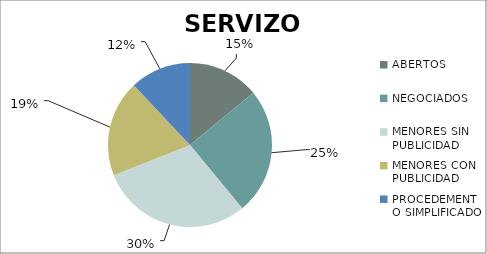
| Category | Series 0 |
|---|---|
| ABERTOS  | 14 |
| NEGOCIADOS  | 25 |
| MENORES SIN PUBLICIDAD | 30 |
| MENORES CON PUBLICIDAD | 19 |
| PROCEDEMENTO SIMPLIFICADO | 12 |